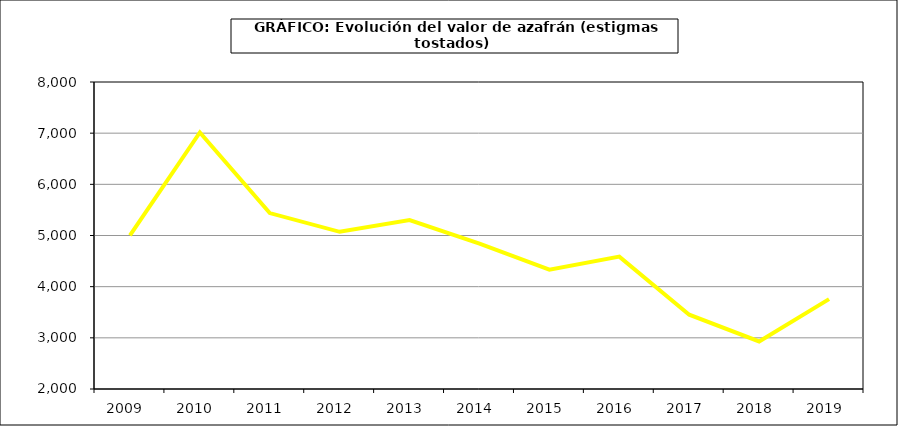
| Category | Valor |
|---|---|
| 2009.0 | 5000.541 |
| 2010.0 | 7014.469 |
| 2011.0 | 5438.177 |
| 2012.0 | 5071.99 |
| 2013.0 | 5302.253 |
| 2014.0 | 4841.325 |
| 2015.0 | 4331 |
| 2016.0 | 4587 |
| 2017.0 | 3451.991 |
| 2018.0 | 2929.42 |
| 2019.0 | 3756.782 |